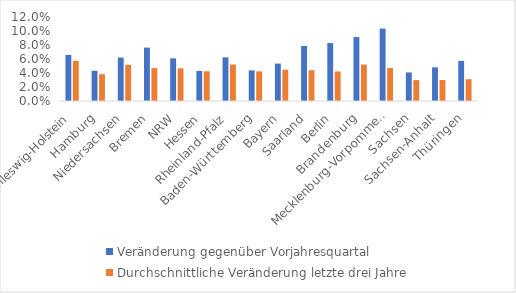
| Category | Veränderung gegenüber Vorjahresquartal | Durchschnittliche Veränderung letzte drei Jahre |
|---|---|---|
| Schleswig-Holstein | 0.066 | 0.057 |
| Hamburg | 0.043 | 0.038 |
| Niedersachsen | 0.062 | 0.052 |
| Bremen | 0.076 | 0.047 |
| NRW | 0.061 | 0.047 |
| Hessen | 0.043 | 0.042 |
| Rheinland-Pfalz | 0.062 | 0.052 |
| Baden-Württemberg | 0.044 | 0.042 |
| Bayern | 0.053 | 0.045 |
| Saarland | 0.079 | 0.044 |
| Berlin | 0.083 | 0.042 |
| Brandenburg | 0.091 | 0.052 |
| Mecklenburg-Vorpommern | 0.103 | 0.047 |
| Sachsen | 0.041 | 0.03 |
| Sachsen-Anhalt | 0.048 | 0.03 |
| Thüringen | 0.057 | 0.031 |